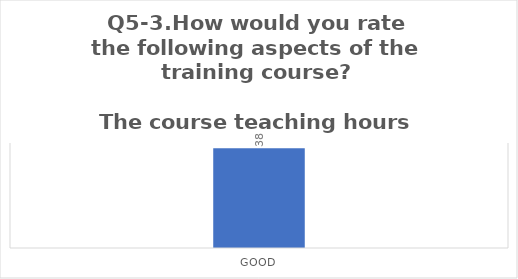
| Category | Q5-3.How would you rate the following aspects of the training course?

The course teaching hours |
|---|---|
| Good | 38 |